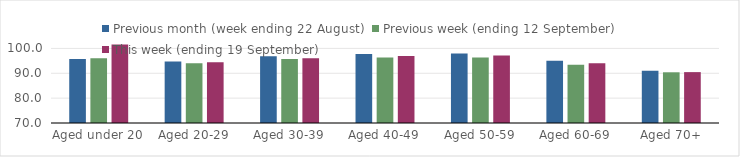
| Category | Previous month (week ending 22 August) | Previous week (ending 12 September) | This week (ending 19 September) |
|---|---|---|---|
| Aged under 20 | 95.74 | 96.03 | 101.57 |
| Aged 20-29 | 94.78 | 94.01 | 94.43 |
| Aged 30-39 | 96.9 | 95.74 | 96.01 |
| Aged 40-49 | 97.79 | 96.4 | 96.95 |
| Aged 50-59 | 97.91 | 96.4 | 97.14 |
| Aged 60-69 | 95.04 | 93.47 | 94.01 |
| Aged 70+ | 91.03 | 90.4 | 90.47 |